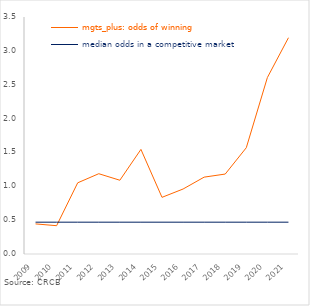
| Category | mgts_plus: odds of winning | median odds in a competitive market |
|---|---|---|
| 2009.0 | 0.444 | 0.47 |
| 2010.0 | 0.418 | 0.47 |
| 2011.0 | 1.051 | 0.47 |
| 2012.0 | 1.186 | 0.47 |
| 2013.0 | 1.089 | 0.47 |
| 2014.0 | 1.545 | 0.47 |
| 2015.0 | 0.837 | 0.47 |
| 2016.0 | 0.96 | 0.47 |
| 2017.0 | 1.135 | 0.47 |
| 2018.0 | 1.181 | 0.47 |
| 2019.0 | 1.57 | 0.47 |
| 2020.0 | 2.606 | 0.47 |
| 2021.0 | 3.194 | 0.47 |